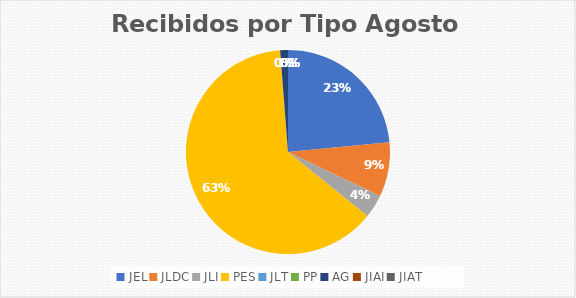
| Category | Series 0 |
|---|---|
| JEL | 19 |
| JLDC | 7 |
| JLI | 3 |
| PES | 51 |
| JLT | 0 |
| PP | 0 |
| AG | 1 |
| JIAI | 0 |
| JIAT | 0 |